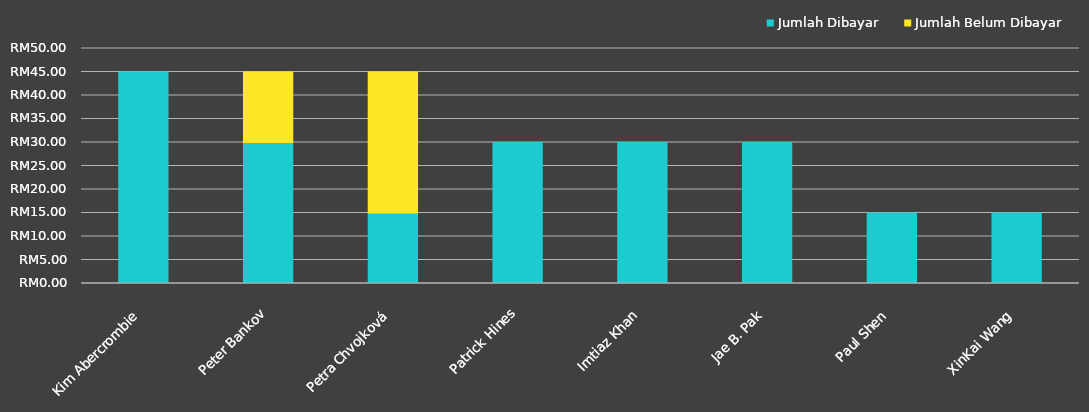
| Category | Jumlah Dibayar | Jumlah Belum Dibayar |
|---|---|---|
| Kim Abercrombie | 45 | 0 |
| Peter Bankov | 30 | 15 |
| Petra Chvojková | 15 | 30 |
| Patrick Hines | 30 | 0 |
| Imtiaz Khan | 30 | 0 |
| Jae B. Pak | 30 | 0 |
| Paul Shen | 15 | 0 |
| XinKai Wang | 15 | 0 |